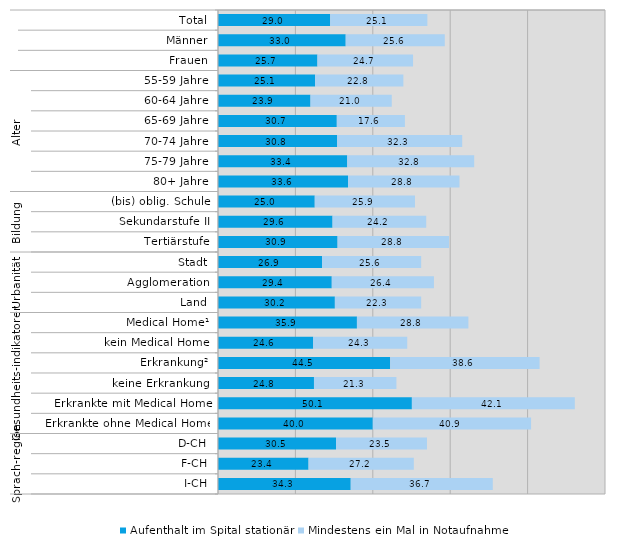
| Category | Aufenthalt im Spital stationär | Mindestens ein Mal in Notaufnahme |
|---|---|---|
| 0 | 29 | 25.1 |
| 1 | 33 | 25.6 |
| 2 | 25.7 | 24.7 |
| 3 | 25.1 | 22.8 |
| 4 | 23.9 | 21 |
| 5 | 30.7 | 17.6 |
| 6 | 30.8 | 32.3 |
| 7 | 33.4 | 32.8 |
| 8 | 33.6 | 28.8 |
| 9 | 25 | 25.9 |
| 10 | 29.6 | 24.2 |
| 11 | 30.9 | 28.8 |
| 12 | 26.9 | 25.6 |
| 13 | 29.4 | 26.4 |
| 14 | 30.2 | 22.3 |
| 15 | 35.9 | 28.8 |
| 16 | 24.6 | 24.3 |
| 17 | 44.5 | 38.6 |
| 18 | 24.8 | 21.3 |
| 19 | 50.1 | 42.1 |
| 20 | 40 | 40.9 |
| 21 | 30.5 | 23.5 |
| 22 | 23.4 | 27.2 |
| 23 | 34.3 | 36.7 |